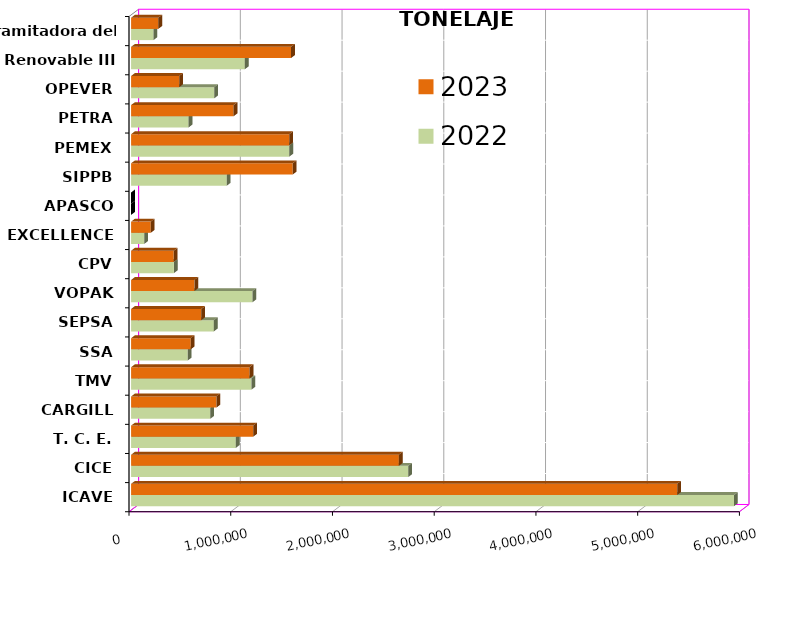
| Category | 2022 | 2023 |
|---|---|---|
| ICAVE | 5926446.271 | 5367879.446 |
| CICE | 2724473.218 | 2632130.135 |
| T. C. E. | 1029367.479 | 1200565.563 |
| CARGILL | 778151.531 | 838853.032 |
| TMV | 1183310.78 | 1164369.19 |
| SSA | 556305.635 | 586399.208 |
| SEPSA | 813510.81 | 689909.34 |
| VOPAK | 1192871.037 | 622169.805 |
| CPV | 420910.21 | 418757.811 |
| EXCELLENCE | 128184.357 | 193198.231 |
| APASCO | 0 | 0 |
| SIPPB | 940108.296 | 1588746.164 |
| PEMEX | 1555533.935 | 1554491.456 |
| PETRA | 564936.67 | 1007484.883 |
| OPEVER | 817437.462 | 473609.469 |
| ESJ Renovable III | 1118443.194 | 1572684.095 |
| Tramitadora del Pac. | 220316.886 | 267610.502 |